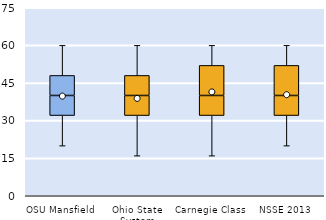
| Category | 25th | 50th | 75th |
|---|---|---|---|
| OSU Mansfield | 32 | 8 | 8 |
| Ohio State System | 32 | 8 | 8 |
| Carnegie Class | 32 | 8 | 12 |
| NSSE 2013 | 32 | 8 | 12 |